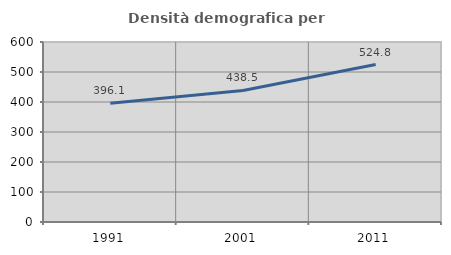
| Category | Densità demografica |
|---|---|
| 1991.0 | 396.14 |
| 2001.0 | 438.522 |
| 2011.0 | 524.76 |